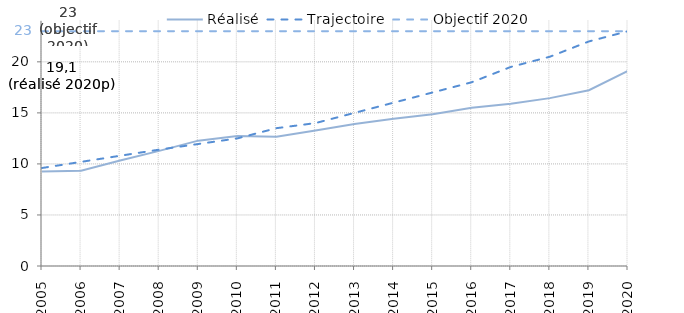
| Category | Réalisé | Trajectoire | Objectif 2020 |
|---|---|---|---|
| 2005.0 | 9.251 | 9.6 | 23 |
| 2006.0 | 9.327 | 10.2 | 23 |
| 2007.0 | 10.34 | 10.8 | 23 |
| 2008.0 | 11.278 | 11.4 | 23 |
| 2009.0 | 12.281 | 11.95 | 23 |
| 2010.0 | 12.729 | 12.5 | 23 |
| 2011.0 | 12.657 | 13.5 | 23 |
| 2012.0 | 13.274 | 14 | 23 |
| 2013.0 | 13.908 | 15 | 23 |
| 2014.0 | 14.422 | 16 | 23 |
| 2015.0 | 14.861 | 17 | 23 |
| 2016.0 | 15.501 | 18 | 23 |
| 2017.0 | 15.904 | 19.5 | 23 |
| 2018.0 | 16.445 | 20.5 | 23 |
| 2019.0 | 17.216 | 22 | 23 |
| 2020.0 | 19.114 | 23 | 23 |